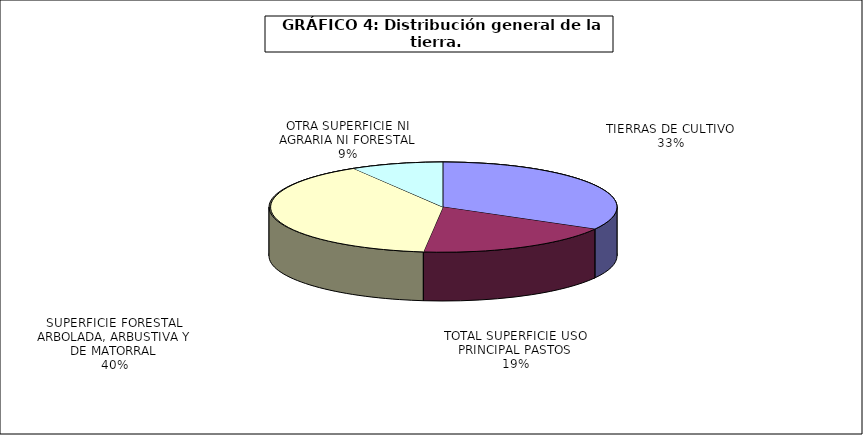
| Category | Series 0 |
|---|---|
| TIERRAS DE CULTIVO | 16759806.633 |
| TOTAL SUPERFICIE USO PRINCIPAL PASTOS | 9446884 |
| SUPERFICIE FORESTAL ARBOLADA, ARBUSTIVA Y DE MATORRAL | 20048091 |
| OTRA SUPERFICIE NI AGRARIA NI FORESTAL | 4340498 |